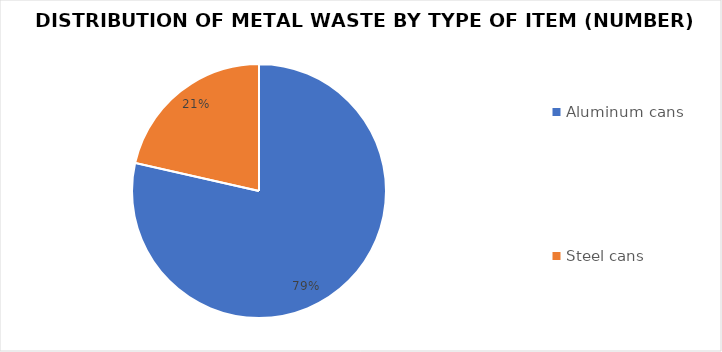
| Category | Series 0 |
|---|---|
| Aluminum cans | 1476 |
| Steel cans | 403 |